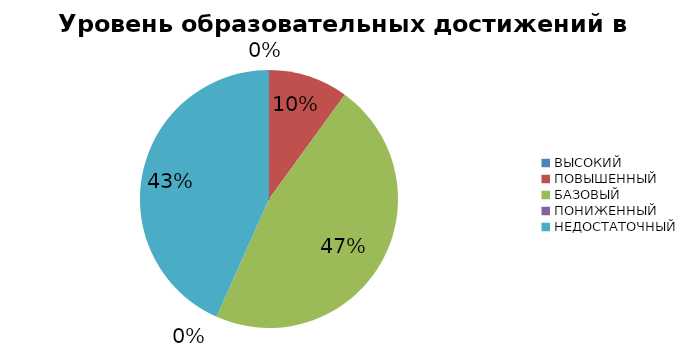
| Category | Series 0 |
|---|---|
| ВЫСОКИЙ | 0 |
| ПОВЫШЕННЫЙ | 17.647 |
| БАЗОВЫЙ | 82.353 |
| ПОНИЖЕННЫЙ | 0 |
| НЕДОСТАТОЧНЫЙ | 76.471 |